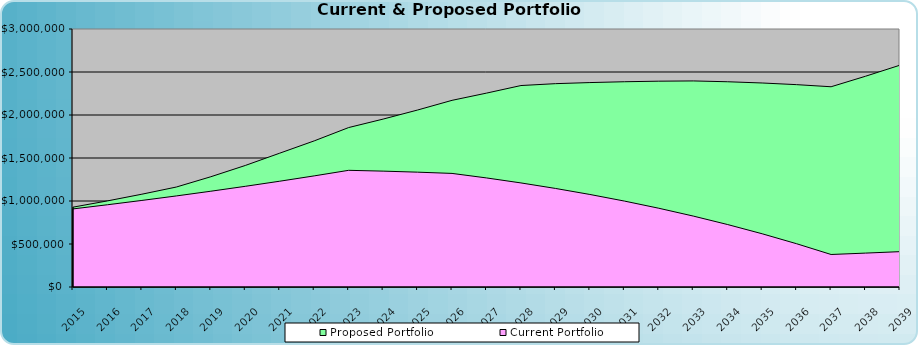
| Category | Proposed Portfolio | Current Portfolio |
|---|---|---|
| 2015.0 | 928246.5 | 908044.625 |
| 2016.0 | 1001232.57 | 956264.464 |
| 2017.0 | 1079208.843 | 1006544.688 |
| 2018.0 | 1162516.51 | 1058973.336 |
| 2019.0 | 1282115.476 | 1113642.208 |
| 2020.0 | 1413019.749 | 1170647.026 |
| 2021.0 | 1556297.984 | 1230087.602 |
| 2022.0 | 1699071.462 | 1292068.016 |
| 2023.0 | 1854052.072 | 1356696.79 |
| 2024.0 | 1952520.81 | 1347217.087 |
| 2025.0 | 2057842.704 | 1335308.826 |
| 2026.0 | 2170578.165 | 1320807.532 |
| 2027.0 | 2254450.778 | 1268244.317 |
| 2028.0 | 2342546.299 | 1210165.128 |
| 2029.0 | 2364430.987 | 1146236.174 |
| 2030.0 | 2377011.714 | 1076106.456 |
| 2031.0 | 2386687.552 | 999406.949 |
| 2032.0 | 2393186.724 | 915749.734 |
| 2033.0 | 2396218.914 | 824727.104 |
| 2034.0 | 2386488.307 | 725910.617 |
| 2035.0 | 2372180.881 | 618850.113 |
| 2036.0 | 2352934.372 | 503072.683 |
| 2037.0 | 2328363.841 | 378081.59 |
| 2038.0 | 2450602.943 | 394236.638 |
| 2039.0 | 2579259.598 | 411081.976 |